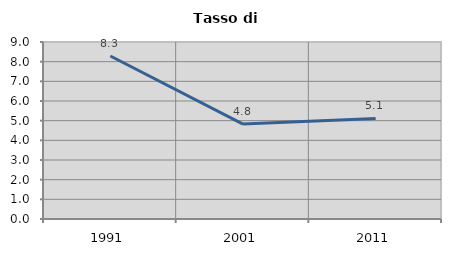
| Category | Tasso di disoccupazione   |
|---|---|
| 1991.0 | 8.29 |
| 2001.0 | 4.828 |
| 2011.0 | 5.111 |